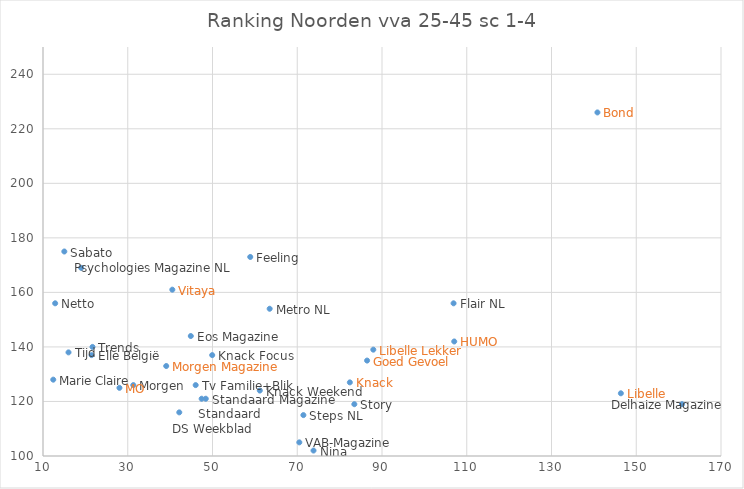
| Category | Selectivity (Target Rating) |
|---|---|
| 160.8 | 119 |
| 146.37 | 123 |
| 140.84 | 226 |
| 109.47 | 341 |
| 107.05 | 142 |
| 106.89 | 156 |
| 87.95 | 139 |
| 86.48 | 135 |
| 83.47 | 119 |
| 82.41 | 127 |
| 73.84 | 102 |
| 71.45 | 115 |
| 70.49 | 105 |
| 63.49 | 154 |
| 61.16 | 124 |
| 58.91 | 173 |
| 49.93 | 137 |
| 48.41 | 121 |
| 47.44 | 121 |
| 46.03 | 126 |
| 44.88 | 144 |
| 42.16 | 116 |
| 40.52 | 161 |
| 39.08 | 133 |
| 31.31 | 126 |
| 28.04 | 125 |
| 21.68 | 140 |
| 21.46 | 137 |
| 19.01 | 169 |
| 16.02 | 138 |
| 15.03 | 175 |
| 12.87 | 156 |
| 12.42 | 128 |